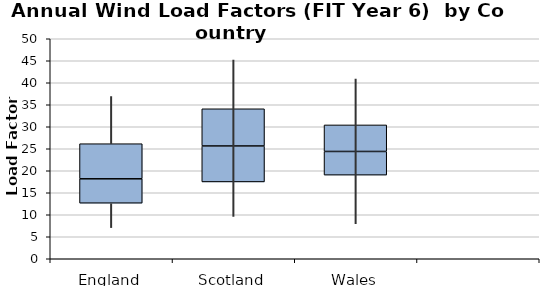
| Category | Series 0 | Series 1 | Series 2 |
|---|---|---|---|
| 0 | 12.629 | 5.542 | 7.978 |
| 1 | 17.464 | 8.169 | 8.454 |
| 2 | 19.006 | 5.377 | 6.032 |